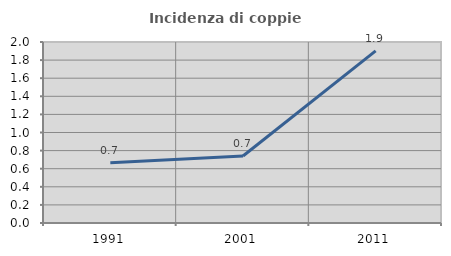
| Category | Incidenza di coppie miste |
|---|---|
| 1991.0 | 0.667 |
| 2001.0 | 0.741 |
| 2011.0 | 1.901 |